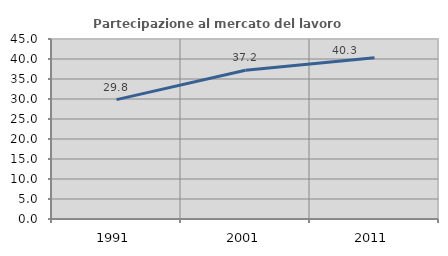
| Category | Partecipazione al mercato del lavoro  femminile |
|---|---|
| 1991.0 | 29.849 |
| 2001.0 | 37.206 |
| 2011.0 | 40.288 |